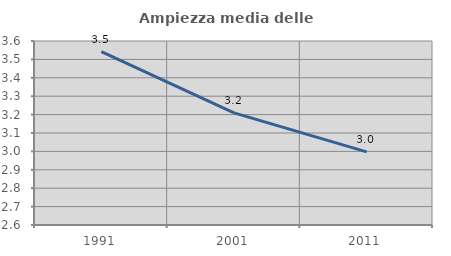
| Category | Ampiezza media delle famiglie |
|---|---|
| 1991.0 | 3.543 |
| 2001.0 | 3.209 |
| 2011.0 | 2.997 |